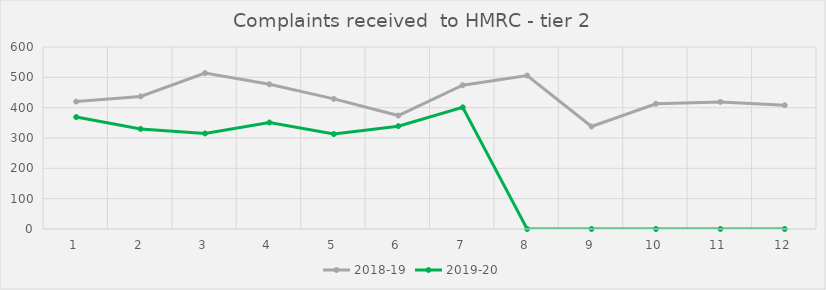
| Category | 2018-19 | 2019-20 |
|---|---|---|
| 0 | 420 | 369 |
| 1 | 437 | 330 |
| 2 | 514 | 315 |
| 3 | 477 | 351 |
| 4 | 429 | 313 |
| 5 | 374 | 339 |
| 6 | 474 | 401 |
| 7 | 506 | 0 |
| 8 | 338 | 0 |
| 9 | 413 | 0 |
| 10 | 419 | 0 |
| 11 | 408 | 0 |